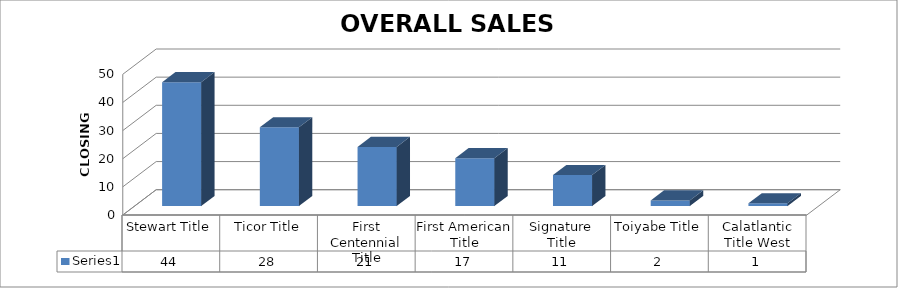
| Category | Series 0 |
|---|---|
| Stewart Title | 44 |
| Ticor Title | 28 |
| First Centennial Title | 21 |
| First American Title | 17 |
| Signature Title | 11 |
| Toiyabe Title | 2 |
| Calatlantic Title West | 1 |